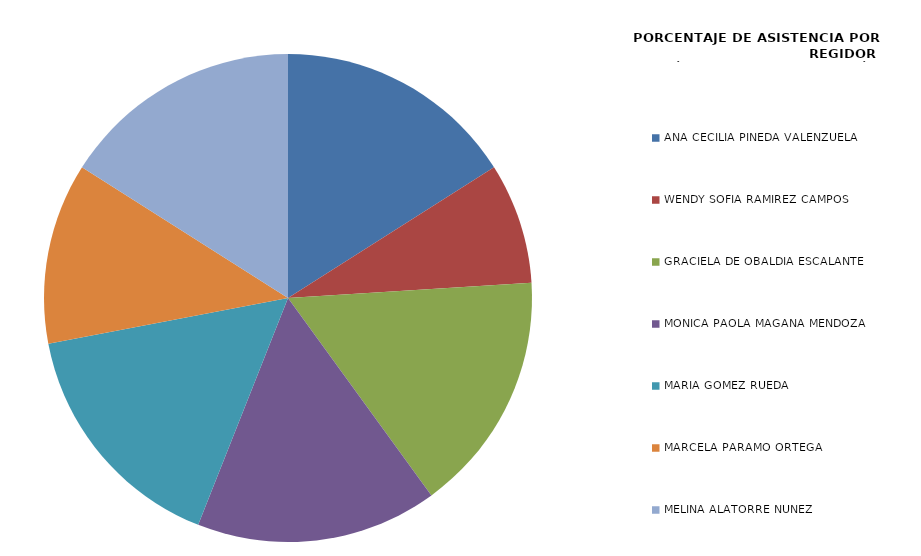
| Category | Series 0 |
|---|---|
| ANA CECILIA PINEDA VALENZUELA | 100 |
| WENDY SOFÍA RAMÍREZ CAMPOS | 50 |
| GRACIELA DE OBALDÍA ESCALANTE | 100 |
| MÓNICA PAOLA MAGAÑA MENDOZA | 100 |
| MARÍA GÓMEZ RUEDA | 100 |
| MARCELA PÁRAMO ORTEGA | 75 |
| MELINA ALATORRE NÚÑEZ | 100 |